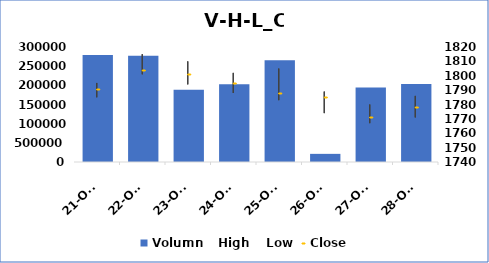
| Category | Volumn |
|---|---|
| 2021-10-21 | 2790400 |
| 2021-10-22 | 2771900 |
| 2021-10-23 | 1885500 |
| 2021-10-24 | 2029800 |
| 2021-10-25 | 2651100 |
| 2021-10-26 | 212330 |
| 2021-10-27 | 1946000 |
| 2021-10-28 | 2037600 |